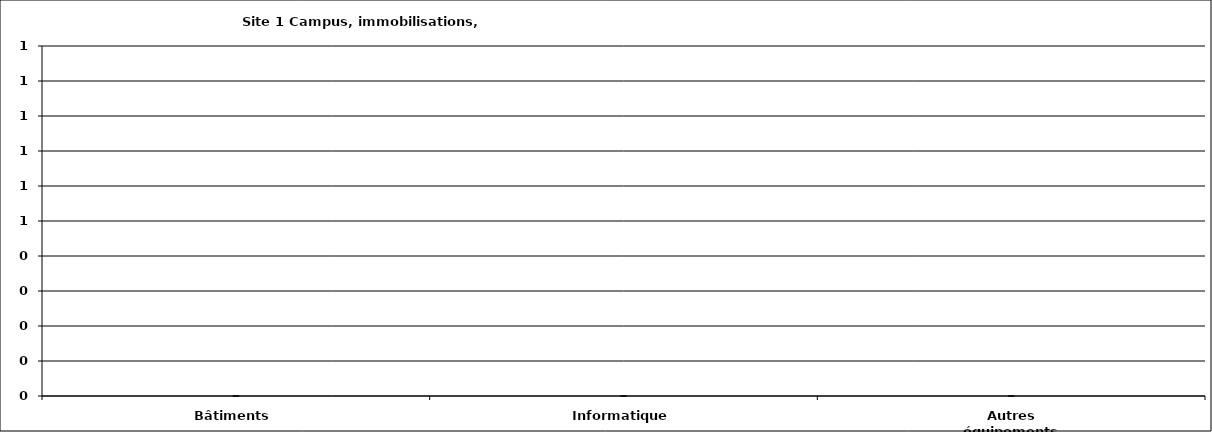
| Category | Series 0 |
|---|---|
| Bâtiments | 0 |
| Informatique | 0 |
| Autres équipements | 0 |